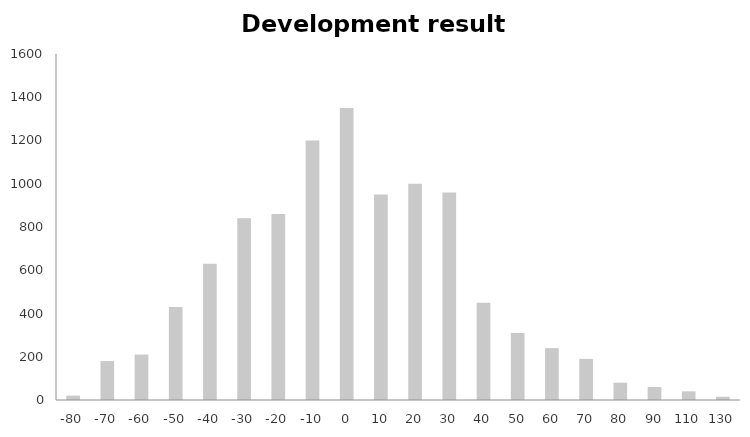
| Category | Series 0 |
|---|---|
| -80.0 | 20 |
| -70.0 | 180 |
| -60.0 | 210 |
| -50.0 | 430 |
| -40.0 | 630 |
| -30.0 | 840 |
| -20.0 | 860 |
| -10.0 | 1200 |
| 0.0 | 1350 |
| 10.0 | 950 |
| 20.0 | 1000 |
| 30.0 | 960 |
| 40.0 | 450 |
| 50.0 | 310 |
| 60.0 | 240 |
| 70.0 | 190 |
| 80.0 | 80 |
| 90.0 | 60 |
| 110.0 | 40 |
| 130.0 | 15 |